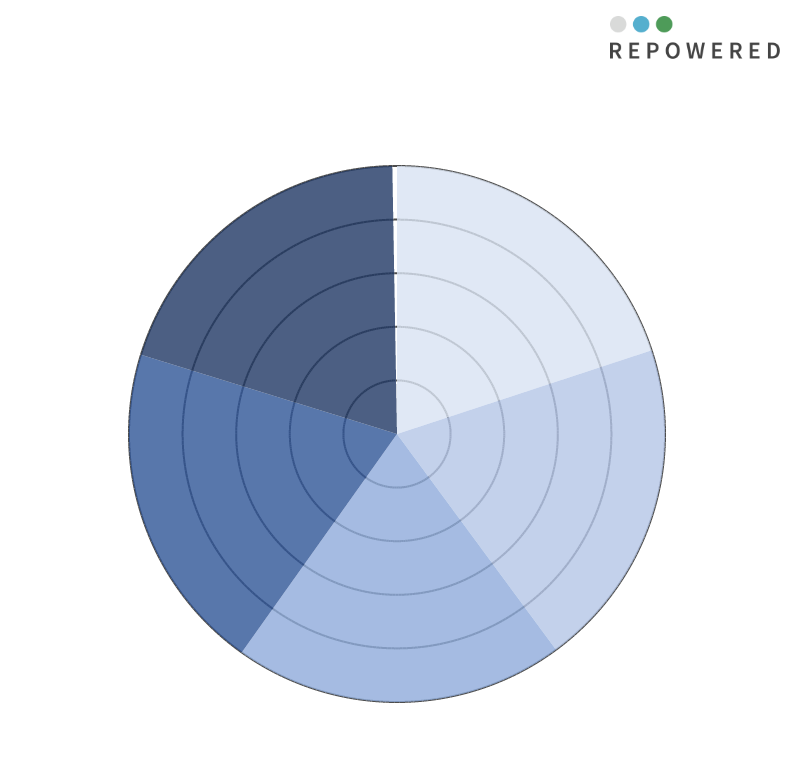
| Category | Waterstoftankstation  < 20 km | Waterstofwijk  < 5 km | Industriële vraag < 5 km | Binnen 5 km van backbone | Overige waterstofvraag |
|---|---|---|---|---|---|
| 0 | 10 | 0 | 0 | 0 | 0 |
| 1 | 10 | 0 | 0 | 0 | 0 |
| 2 | 10 | 0 | 0 | 0 | 0 |
| 3 | 10 | 0 | 0 | 0 | 0 |
| 4 | 10 | 0 | 0 | 0 | 0 |
| 5 | 10 | 0 | 0 | 0 | 0 |
| 6 | 10 | 0 | 0 | 0 | 0 |
| 7 | 10 | 0 | 0 | 0 | 0 |
| 8 | 10 | 0 | 0 | 0 | 0 |
| 9 | 10 | 0 | 0 | 0 | 0 |
| 10 | 10 | 0 | 0 | 0 | 0 |
| 11 | 10 | 0 | 0 | 0 | 0 |
| 12 | 10 | 0 | 0 | 0 | 0 |
| 13 | 10 | 0 | 0 | 0 | 0 |
| 14 | 10 | 0 | 0 | 0 | 0 |
| 15 | 10 | 0 | 0 | 0 | 0 |
| 16 | 10 | 0 | 0 | 0 | 0 |
| 17 | 10 | 0 | 0 | 0 | 0 |
| 18 | 10 | 0 | 0 | 0 | 0 |
| 19 | 10 | 0 | 0 | 0 | 0 |
| 20 | 10 | 0 | 0 | 0 | 0 |
| 21 | 10 | 0 | 0 | 0 | 0 |
| 22 | 10 | 0 | 0 | 0 | 0 |
| 23 | 10 | 0 | 0 | 0 | 0 |
| 24 | 10 | 0 | 0 | 0 | 0 |
| 25 | 10 | 0 | 0 | 0 | 0 |
| 26 | 10 | 0 | 0 | 0 | 0 |
| 27 | 10 | 0 | 0 | 0 | 0 |
| 28 | 10 | 0 | 0 | 0 | 0 |
| 29 | 10 | 0 | 0 | 0 | 0 |
| 30 | 10 | 0 | 0 | 0 | 0 |
| 31 | 10 | 0 | 0 | 0 | 0 |
| 32 | 10 | 0 | 0 | 0 | 0 |
| 33 | 10 | 0 | 0 | 0 | 0 |
| 34 | 10 | 0 | 0 | 0 | 0 |
| 35 | 10 | 0 | 0 | 0 | 0 |
| 36 | 10 | 0 | 0 | 0 | 0 |
| 37 | 10 | 0 | 0 | 0 | 0 |
| 38 | 10 | 0 | 0 | 0 | 0 |
| 39 | 10 | 0 | 0 | 0 | 0 |
| 40 | 10 | 0 | 0 | 0 | 0 |
| 41 | 10 | 0 | 0 | 0 | 0 |
| 42 | 10 | 0 | 0 | 0 | 0 |
| 43 | 10 | 0 | 0 | 0 | 0 |
| 44 | 10 | 0 | 0 | 0 | 0 |
| 45 | 10 | 0 | 0 | 0 | 0 |
| 46 | 10 | 0 | 0 | 0 | 0 |
| 47 | 10 | 0 | 0 | 0 | 0 |
| 48 | 10 | 0 | 0 | 0 | 0 |
| 49 | 10 | 0 | 0 | 0 | 0 |
| 50 | 10 | 0 | 0 | 0 | 0 |
| 51 | 10 | 0 | 0 | 0 | 0 |
| 52 | 10 | 0 | 0 | 0 | 0 |
| 53 | 10 | 0 | 0 | 0 | 0 |
| 54 | 10 | 0 | 0 | 0 | 0 |
| 55 | 10 | 0 | 0 | 0 | 0 |
| 56 | 10 | 0 | 0 | 0 | 0 |
| 57 | 10 | 0 | 0 | 0 | 0 |
| 58 | 10 | 0 | 0 | 0 | 0 |
| 59 | 10 | 0 | 0 | 0 | 0 |
| 60 | 10 | 0 | 0 | 0 | 0 |
| 61 | 10 | 0 | 0 | 0 | 0 |
| 62 | 10 | 0 | 0 | 0 | 0 |
| 63 | 10 | 0 | 0 | 0 | 0 |
| 64 | 10 | 0 | 0 | 0 | 0 |
| 65 | 10 | 0 | 0 | 0 | 0 |
| 66 | 10 | 0 | 0 | 0 | 0 |
| 67 | 10 | 0 | 0 | 0 | 0 |
| 68 | 10 | 0 | 0 | 0 | 0 |
| 69 | 10 | 0 | 0 | 0 | 0 |
| 70 | 10 | 0 | 0 | 0 | 0 |
| 71 | 10 | 0 | 0 | 0 | 0 |
| 72 | 10 | 10 | 0 | 0 | 0 |
| 73 | 0 | 10 | 0 | 0 | 0 |
| 74 | 0 | 10 | 0 | 0 | 0 |
| 75 | 0 | 10 | 0 | 0 | 0 |
| 76 | 0 | 10 | 0 | 0 | 0 |
| 77 | 0 | 10 | 0 | 0 | 0 |
| 78 | 0 | 10 | 0 | 0 | 0 |
| 79 | 0 | 10 | 0 | 0 | 0 |
| 80 | 0 | 10 | 0 | 0 | 0 |
| 81 | 0 | 10 | 0 | 0 | 0 |
| 82 | 0 | 10 | 0 | 0 | 0 |
| 83 | 0 | 10 | 0 | 0 | 0 |
| 84 | 0 | 10 | 0 | 0 | 0 |
| 85 | 0 | 10 | 0 | 0 | 0 |
| 86 | 0 | 10 | 0 | 0 | 0 |
| 87 | 0 | 10 | 0 | 0 | 0 |
| 88 | 0 | 10 | 0 | 0 | 0 |
| 89 | 0 | 10 | 0 | 0 | 0 |
| 90 | 0 | 10 | 0 | 0 | 0 |
| 91 | 0 | 10 | 0 | 0 | 0 |
| 92 | 0 | 10 | 0 | 0 | 0 |
| 93 | 0 | 10 | 0 | 0 | 0 |
| 94 | 0 | 10 | 0 | 0 | 0 |
| 95 | 0 | 10 | 0 | 0 | 0 |
| 96 | 0 | 10 | 0 | 0 | 0 |
| 97 | 0 | 10 | 0 | 0 | 0 |
| 98 | 0 | 10 | 0 | 0 | 0 |
| 99 | 0 | 10 | 0 | 0 | 0 |
| 100 | 0 | 10 | 0 | 0 | 0 |
| 101 | 0 | 10 | 0 | 0 | 0 |
| 102 | 0 | 10 | 0 | 0 | 0 |
| 103 | 0 | 10 | 0 | 0 | 0 |
| 104 | 0 | 10 | 0 | 0 | 0 |
| 105 | 0 | 10 | 0 | 0 | 0 |
| 106 | 0 | 10 | 0 | 0 | 0 |
| 107 | 0 | 10 | 0 | 0 | 0 |
| 108 | 0 | 10 | 0 | 0 | 0 |
| 109 | 0 | 10 | 0 | 0 | 0 |
| 110 | 0 | 10 | 0 | 0 | 0 |
| 111 | 0 | 10 | 0 | 0 | 0 |
| 112 | 0 | 10 | 0 | 0 | 0 |
| 113 | 0 | 10 | 0 | 0 | 0 |
| 114 | 0 | 10 | 0 | 0 | 0 |
| 115 | 0 | 10 | 0 | 0 | 0 |
| 116 | 0 | 10 | 0 | 0 | 0 |
| 117 | 0 | 10 | 0 | 0 | 0 |
| 118 | 0 | 10 | 0 | 0 | 0 |
| 119 | 0 | 10 | 0 | 0 | 0 |
| 120 | 0 | 10 | 0 | 0 | 0 |
| 121 | 0 | 10 | 0 | 0 | 0 |
| 122 | 0 | 10 | 0 | 0 | 0 |
| 123 | 0 | 10 | 0 | 0 | 0 |
| 124 | 0 | 10 | 0 | 0 | 0 |
| 125 | 0 | 10 | 0 | 0 | 0 |
| 126 | 0 | 10 | 0 | 0 | 0 |
| 127 | 0 | 10 | 0 | 0 | 0 |
| 128 | 0 | 10 | 0 | 0 | 0 |
| 129 | 0 | 10 | 0 | 0 | 0 |
| 130 | 0 | 10 | 0 | 0 | 0 |
| 131 | 0 | 10 | 0 | 0 | 0 |
| 132 | 0 | 10 | 0 | 0 | 0 |
| 133 | 0 | 10 | 0 | 0 | 0 |
| 134 | 0 | 10 | 0 | 0 | 0 |
| 135 | 0 | 10 | 0 | 0 | 0 |
| 136 | 0 | 10 | 0 | 0 | 0 |
| 137 | 0 | 10 | 0 | 0 | 0 |
| 138 | 0 | 10 | 0 | 0 | 0 |
| 139 | 0 | 10 | 0 | 0 | 0 |
| 140 | 0 | 10 | 0 | 0 | 0 |
| 141 | 0 | 10 | 0 | 0 | 0 |
| 142 | 0 | 10 | 0 | 0 | 0 |
| 143 | 0 | 10 | 0 | 0 | 0 |
| 144 | 0 | 10 | 10 | 0 | 0 |
| 145 | 0 | 0 | 10 | 0 | 0 |
| 146 | 0 | 0 | 10 | 0 | 0 |
| 147 | 0 | 0 | 10 | 0 | 0 |
| 148 | 0 | 0 | 10 | 0 | 0 |
| 149 | 0 | 0 | 10 | 0 | 0 |
| 150 | 0 | 0 | 10 | 0 | 0 |
| 151 | 0 | 0 | 10 | 0 | 0 |
| 152 | 0 | 0 | 10 | 0 | 0 |
| 153 | 0 | 0 | 10 | 0 | 0 |
| 154 | 0 | 0 | 10 | 0 | 0 |
| 155 | 0 | 0 | 10 | 0 | 0 |
| 156 | 0 | 0 | 10 | 0 | 0 |
| 157 | 0 | 0 | 10 | 0 | 0 |
| 158 | 0 | 0 | 10 | 0 | 0 |
| 159 | 0 | 0 | 10 | 0 | 0 |
| 160 | 0 | 0 | 10 | 0 | 0 |
| 161 | 0 | 0 | 10 | 0 | 0 |
| 162 | 0 | 0 | 10 | 0 | 0 |
| 163 | 0 | 0 | 10 | 0 | 0 |
| 164 | 0 | 0 | 10 | 0 | 0 |
| 165 | 0 | 0 | 10 | 0 | 0 |
| 166 | 0 | 0 | 10 | 0 | 0 |
| 167 | 0 | 0 | 10 | 0 | 0 |
| 168 | 0 | 0 | 10 | 0 | 0 |
| 169 | 0 | 0 | 10 | 0 | 0 |
| 170 | 0 | 0 | 10 | 0 | 0 |
| 171 | 0 | 0 | 10 | 0 | 0 |
| 172 | 0 | 0 | 10 | 0 | 0 |
| 173 | 0 | 0 | 10 | 0 | 0 |
| 174 | 0 | 0 | 10 | 0 | 0 |
| 175 | 0 | 0 | 10 | 0 | 0 |
| 176 | 0 | 0 | 10 | 0 | 0 |
| 177 | 0 | 0 | 10 | 0 | 0 |
| 178 | 0 | 0 | 10 | 0 | 0 |
| 179 | 0 | 0 | 10 | 0 | 0 |
| 180 | 0 | 0 | 10 | 0 | 0 |
| 181 | 0 | 0 | 10 | 0 | 0 |
| 182 | 0 | 0 | 10 | 0 | 0 |
| 183 | 0 | 0 | 10 | 0 | 0 |
| 184 | 0 | 0 | 10 | 0 | 0 |
| 185 | 0 | 0 | 10 | 0 | 0 |
| 186 | 0 | 0 | 10 | 0 | 0 |
| 187 | 0 | 0 | 10 | 0 | 0 |
| 188 | 0 | 0 | 10 | 0 | 0 |
| 189 | 0 | 0 | 10 | 0 | 0 |
| 190 | 0 | 0 | 10 | 0 | 0 |
| 191 | 0 | 0 | 10 | 0 | 0 |
| 192 | 0 | 0 | 10 | 0 | 0 |
| 193 | 0 | 0 | 10 | 0 | 0 |
| 194 | 0 | 0 | 10 | 0 | 0 |
| 195 | 0 | 0 | 10 | 0 | 0 |
| 196 | 0 | 0 | 10 | 0 | 0 |
| 197 | 0 | 0 | 10 | 0 | 0 |
| 198 | 0 | 0 | 10 | 0 | 0 |
| 199 | 0 | 0 | 10 | 0 | 0 |
| 200 | 0 | 0 | 10 | 0 | 0 |
| 201 | 0 | 0 | 10 | 0 | 0 |
| 202 | 0 | 0 | 10 | 0 | 0 |
| 203 | 0 | 0 | 10 | 0 | 0 |
| 204 | 0 | 0 | 10 | 0 | 0 |
| 205 | 0 | 0 | 10 | 0 | 0 |
| 206 | 0 | 0 | 10 | 0 | 0 |
| 207 | 0 | 0 | 10 | 0 | 0 |
| 208 | 0 | 0 | 10 | 0 | 0 |
| 209 | 0 | 0 | 10 | 0 | 0 |
| 210 | 0 | 0 | 10 | 0 | 0 |
| 211 | 0 | 0 | 10 | 0 | 0 |
| 212 | 0 | 0 | 10 | 0 | 0 |
| 213 | 0 | 0 | 10 | 0 | 0 |
| 214 | 0 | 0 | 10 | 0 | 0 |
| 215 | 0 | 0 | 10 | 0 | 0 |
| 216 | 0 | 0 | 10 | 10 | 0 |
| 217 | 0 | 0 | 0 | 10 | 0 |
| 218 | 0 | 0 | 0 | 10 | 0 |
| 219 | 0 | 0 | 0 | 10 | 0 |
| 220 | 0 | 0 | 0 | 10 | 0 |
| 221 | 0 | 0 | 0 | 10 | 0 |
| 222 | 0 | 0 | 0 | 10 | 0 |
| 223 | 0 | 0 | 0 | 10 | 0 |
| 224 | 0 | 0 | 0 | 10 | 0 |
| 225 | 0 | 0 | 0 | 10 | 0 |
| 226 | 0 | 0 | 0 | 10 | 0 |
| 227 | 0 | 0 | 0 | 10 | 0 |
| 228 | 0 | 0 | 0 | 10 | 0 |
| 229 | 0 | 0 | 0 | 10 | 0 |
| 230 | 0 | 0 | 0 | 10 | 0 |
| 231 | 0 | 0 | 0 | 10 | 0 |
| 232 | 0 | 0 | 0 | 10 | 0 |
| 233 | 0 | 0 | 0 | 10 | 0 |
| 234 | 0 | 0 | 0 | 10 | 0 |
| 235 | 0 | 0 | 0 | 10 | 0 |
| 236 | 0 | 0 | 0 | 10 | 0 |
| 237 | 0 | 0 | 0 | 10 | 0 |
| 238 | 0 | 0 | 0 | 10 | 0 |
| 239 | 0 | 0 | 0 | 10 | 0 |
| 240 | 0 | 0 | 0 | 10 | 0 |
| 241 | 0 | 0 | 0 | 10 | 0 |
| 242 | 0 | 0 | 0 | 10 | 0 |
| 243 | 0 | 0 | 0 | 10 | 0 |
| 244 | 0 | 0 | 0 | 10 | 0 |
| 245 | 0 | 0 | 0 | 10 | 0 |
| 246 | 0 | 0 | 0 | 10 | 0 |
| 247 | 0 | 0 | 0 | 10 | 0 |
| 248 | 0 | 0 | 0 | 10 | 0 |
| 249 | 0 | 0 | 0 | 10 | 0 |
| 250 | 0 | 0 | 0 | 10 | 0 |
| 251 | 0 | 0 | 0 | 10 | 0 |
| 252 | 0 | 0 | 0 | 10 | 0 |
| 253 | 0 | 0 | 0 | 10 | 0 |
| 254 | 0 | 0 | 0 | 10 | 0 |
| 255 | 0 | 0 | 0 | 10 | 0 |
| 256 | 0 | 0 | 0 | 10 | 0 |
| 257 | 0 | 0 | 0 | 10 | 0 |
| 258 | 0 | 0 | 0 | 10 | 0 |
| 259 | 0 | 0 | 0 | 10 | 0 |
| 260 | 0 | 0 | 0 | 10 | 0 |
| 261 | 0 | 0 | 0 | 10 | 0 |
| 262 | 0 | 0 | 0 | 10 | 0 |
| 263 | 0 | 0 | 0 | 10 | 0 |
| 264 | 0 | 0 | 0 | 10 | 0 |
| 265 | 0 | 0 | 0 | 10 | 0 |
| 266 | 0 | 0 | 0 | 10 | 0 |
| 267 | 0 | 0 | 0 | 10 | 0 |
| 268 | 0 | 0 | 0 | 10 | 0 |
| 269 | 0 | 0 | 0 | 10 | 0 |
| 270 | 0 | 0 | 0 | 10 | 0 |
| 271 | 0 | 0 | 0 | 10 | 0 |
| 272 | 0 | 0 | 0 | 10 | 0 |
| 273 | 0 | 0 | 0 | 10 | 0 |
| 274 | 0 | 0 | 0 | 10 | 0 |
| 275 | 0 | 0 | 0 | 10 | 0 |
| 276 | 0 | 0 | 0 | 10 | 0 |
| 277 | 0 | 0 | 0 | 10 | 0 |
| 278 | 0 | 0 | 0 | 10 | 0 |
| 279 | 0 | 0 | 0 | 10 | 0 |
| 280 | 0 | 0 | 0 | 10 | 0 |
| 281 | 0 | 0 | 0 | 10 | 0 |
| 282 | 0 | 0 | 0 | 10 | 0 |
| 283 | 0 | 0 | 0 | 10 | 0 |
| 284 | 0 | 0 | 0 | 10 | 0 |
| 285 | 0 | 0 | 0 | 10 | 0 |
| 286 | 0 | 0 | 0 | 10 | 0 |
| 287 | 0 | 0 | 0 | 10 | 0 |
| 288 | 0 | 0 | 0 | 10 | 0 |
| 289 | 0 | 0 | 0 | 0 | 0 |
| 290 | 0 | 0 | 0 | 0 | 0 |
| 291 | 0 | 0 | 0 | 0 | 0 |
| 292 | 0 | 0 | 0 | 0 | 0 |
| 293 | 0 | 0 | 0 | 0 | 0 |
| 294 | 0 | 0 | 0 | 0 | 0 |
| 295 | 0 | 0 | 0 | 0 | 0 |
| 296 | 0 | 0 | 0 | 0 | 0 |
| 297 | 0 | 0 | 0 | 0 | 0 |
| 298 | 0 | 0 | 0 | 0 | 0 |
| 299 | 0 | 0 | 0 | 0 | 0 |
| 300 | 0 | 0 | 0 | 0 | 0 |
| 301 | 0 | 0 | 0 | 0 | 0 |
| 302 | 0 | 0 | 0 | 0 | 0 |
| 303 | 0 | 0 | 0 | 0 | 0 |
| 304 | 0 | 0 | 0 | 0 | 0 |
| 305 | 0 | 0 | 0 | 0 | 0 |
| 306 | 0 | 0 | 0 | 0 | 0 |
| 307 | 0 | 0 | 0 | 0 | 0 |
| 308 | 0 | 0 | 0 | 0 | 0 |
| 309 | 0 | 0 | 0 | 0 | 0 |
| 310 | 0 | 0 | 0 | 0 | 0 |
| 311 | 0 | 0 | 0 | 0 | 0 |
| 312 | 0 | 0 | 0 | 0 | 0 |
| 313 | 0 | 0 | 0 | 0 | 0 |
| 314 | 0 | 0 | 0 | 0 | 0 |
| 315 | 0 | 0 | 0 | 0 | 0 |
| 316 | 0 | 0 | 0 | 0 | 0 |
| 317 | 0 | 0 | 0 | 0 | 0 |
| 318 | 0 | 0 | 0 | 0 | 0 |
| 319 | 0 | 0 | 0 | 0 | 0 |
| 320 | 0 | 0 | 0 | 0 | 0 |
| 321 | 0 | 0 | 0 | 0 | 0 |
| 322 | 0 | 0 | 0 | 0 | 0 |
| 323 | 0 | 0 | 0 | 0 | 0 |
| 324 | 0 | 0 | 0 | 0 | 0 |
| 325 | 0 | 0 | 0 | 0 | 0 |
| 326 | 0 | 0 | 0 | 0 | 0 |
| 327 | 0 | 0 | 0 | 0 | 0 |
| 328 | 0 | 0 | 0 | 0 | 0 |
| 329 | 0 | 0 | 0 | 0 | 0 |
| 330 | 0 | 0 | 0 | 0 | 0 |
| 331 | 0 | 0 | 0 | 0 | 0 |
| 332 | 0 | 0 | 0 | 0 | 0 |
| 333 | 0 | 0 | 0 | 0 | 0 |
| 334 | 0 | 0 | 0 | 0 | 0 |
| 335 | 0 | 0 | 0 | 0 | 0 |
| 336 | 0 | 0 | 0 | 0 | 0 |
| 337 | 0 | 0 | 0 | 0 | 0 |
| 338 | 0 | 0 | 0 | 0 | 0 |
| 339 | 0 | 0 | 0 | 0 | 0 |
| 340 | 0 | 0 | 0 | 0 | 0 |
| 341 | 0 | 0 | 0 | 0 | 0 |
| 342 | 0 | 0 | 0 | 0 | 0 |
| 343 | 0 | 0 | 0 | 0 | 0 |
| 344 | 0 | 0 | 0 | 0 | 0 |
| 345 | 0 | 0 | 0 | 0 | 0 |
| 346 | 0 | 0 | 0 | 0 | 0 |
| 347 | 0 | 0 | 0 | 0 | 0 |
| 348 | 0 | 0 | 0 | 0 | 0 |
| 349 | 0 | 0 | 0 | 0 | 0 |
| 350 | 0 | 0 | 0 | 0 | 0 |
| 351 | 0 | 0 | 0 | 0 | 0 |
| 352 | 0 | 0 | 0 | 0 | 0 |
| 353 | 0 | 0 | 0 | 0 | 0 |
| 354 | 0 | 0 | 0 | 0 | 0 |
| 355 | 0 | 0 | 0 | 0 | 0 |
| 356 | 0 | 0 | 0 | 0 | 0 |
| 357 | 0 | 0 | 0 | 0 | 0 |
| 358 | 0 | 0 | 0 | 0 | 0 |
| 359 | 0 | 0 | 0 | 0 | 0 |
| 360 | 0 | 0 | 0 | 0 | 10 |